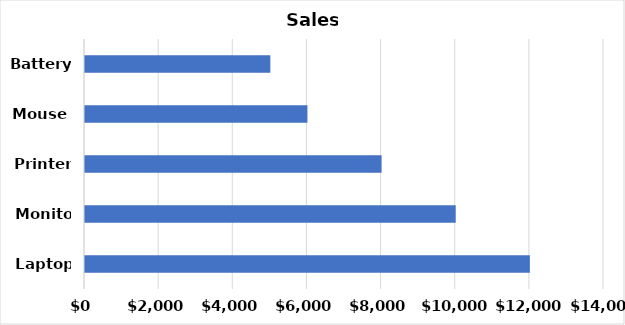
| Category | Sales |
|---|---|
| Laptop | 12000 |
| Monitor | 10000 |
| Printer | 8000 |
| Mouse | 6000 |
| Battery | 5000 |